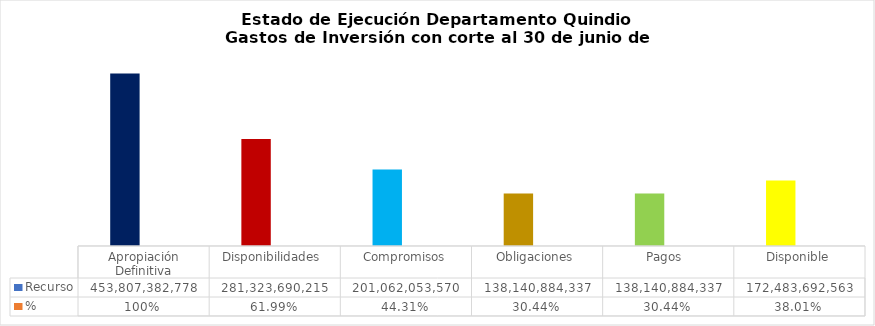
| Category | Recurso  | % |
|---|---|---|
| Apropiación Definitiva | 453807382777.65 | 1 |
| Disponibilidades  | 281323690214.7 | 0.62 |
| Compromisos | 201062053570.1 | 0.443 |
| Obligaciones | 138140884337.43 | 0.304 |
| Pagos  | 138140884337.43 | 0.304 |
| Disponible | 172483692562.95 | 0.38 |